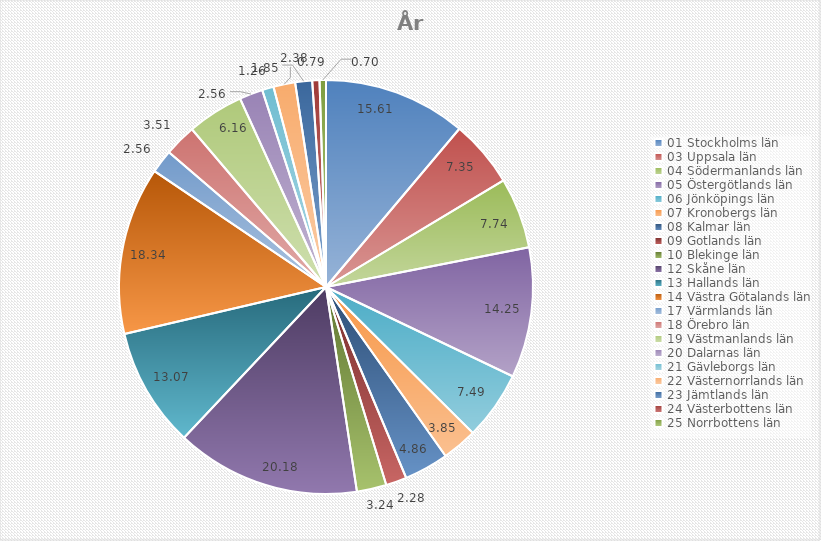
| Category | Series 0 |
|---|---|
| 01 Stockholms län | 15.61 |
| 03 Uppsala län | 7.35 |
| 04 Södermanlands län | 7.74 |
| 05 Östergötlands län | 14.25 |
| 06 Jönköpings län | 7.49 |
| 07 Kronobergs län | 3.85 |
| 08 Kalmar län | 4.86 |
| 09 Gotlands län | 2.28 |
| 10 Blekinge län | 3.24 |
| 12 Skåne län | 20.18 |
| 13 Hallands län | 13.07 |
| 14 Västra Götalands län | 18.34 |
| 17 Värmlands län | 2.56 |
| 18 Örebro län | 3.51 |
| 19 Västmanlands län | 6.16 |
| 20 Dalarnas län | 2.56 |
| 21 Gävleborgs län | 1.26 |
| 22 Västernorrlands län | 2.38 |
| 23 Jämtlands län | 1.85 |
| 24 Västerbottens län | 0.79 |
| 25 Norrbottens län | 0.7 |